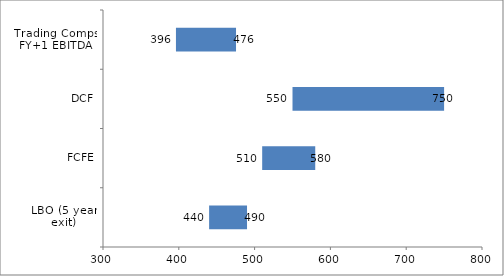
| Category | Series 0 | Series 1 |
|---|---|---|
| LBO (5 year exit) | 440 | 50 |
| FCFE | 510 | 70 |
| DCF | 550 | 200 |
| Trading Comps FY+1 EBITDA | 396.242 | 79.248 |